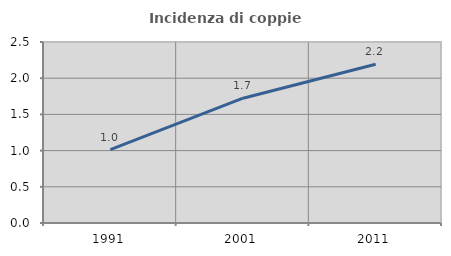
| Category | Incidenza di coppie miste |
|---|---|
| 1991.0 | 1.014 |
| 2001.0 | 1.724 |
| 2011.0 | 2.193 |